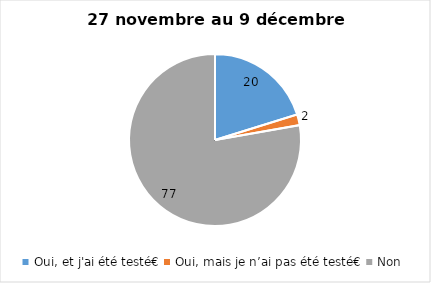
| Category | Series 0 |
|---|---|
| Oui, et j'ai été testé€ | 20 |
| Oui, mais je n’ai pas été testé€ | 2 |
| Non | 77 |